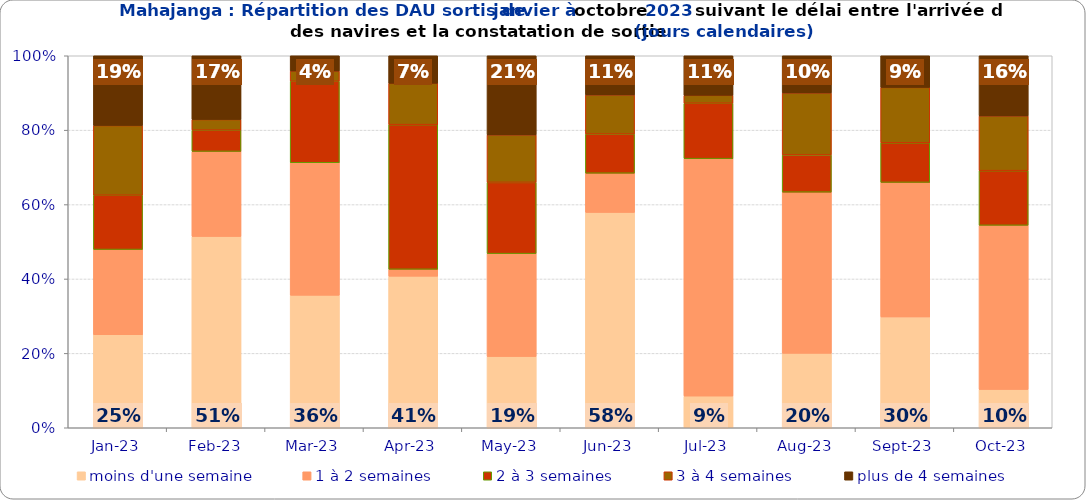
| Category | moins d'une semaine | 1 à 2 semaines | 2 à 3 semaines | 3 à 4 semaines | plus de 4 semaines |
|---|---|---|---|---|---|
| 2023-01-01 | 0.25 | 0.229 | 0.146 | 0.188 | 0.188 |
| 2023-02-01 | 0.514 | 0.229 | 0.057 | 0.029 | 0.171 |
| 2023-03-01 | 0.356 | 0.356 | 0.219 | 0.027 | 0.041 |
| 2023-04-01 | 0.407 | 0.019 | 0.389 | 0.111 | 0.074 |
| 2023-05-01 | 0.191 | 0.277 | 0.191 | 0.128 | 0.213 |
| 2023-06-01 | 0.579 | 0.105 | 0.105 | 0.105 | 0.105 |
| 2023-07-01 | 0.085 | 0.638 | 0.149 | 0.021 | 0.106 |
| 2023-08-01 | 0.2 | 0.433 | 0.1 | 0.167 | 0.1 |
| 2023-09-01 | 0.298 | 0.362 | 0.106 | 0.149 | 0.085 |
| 2023-10-01 | 0.103 | 0.441 | 0.147 | 0.147 | 0.162 |